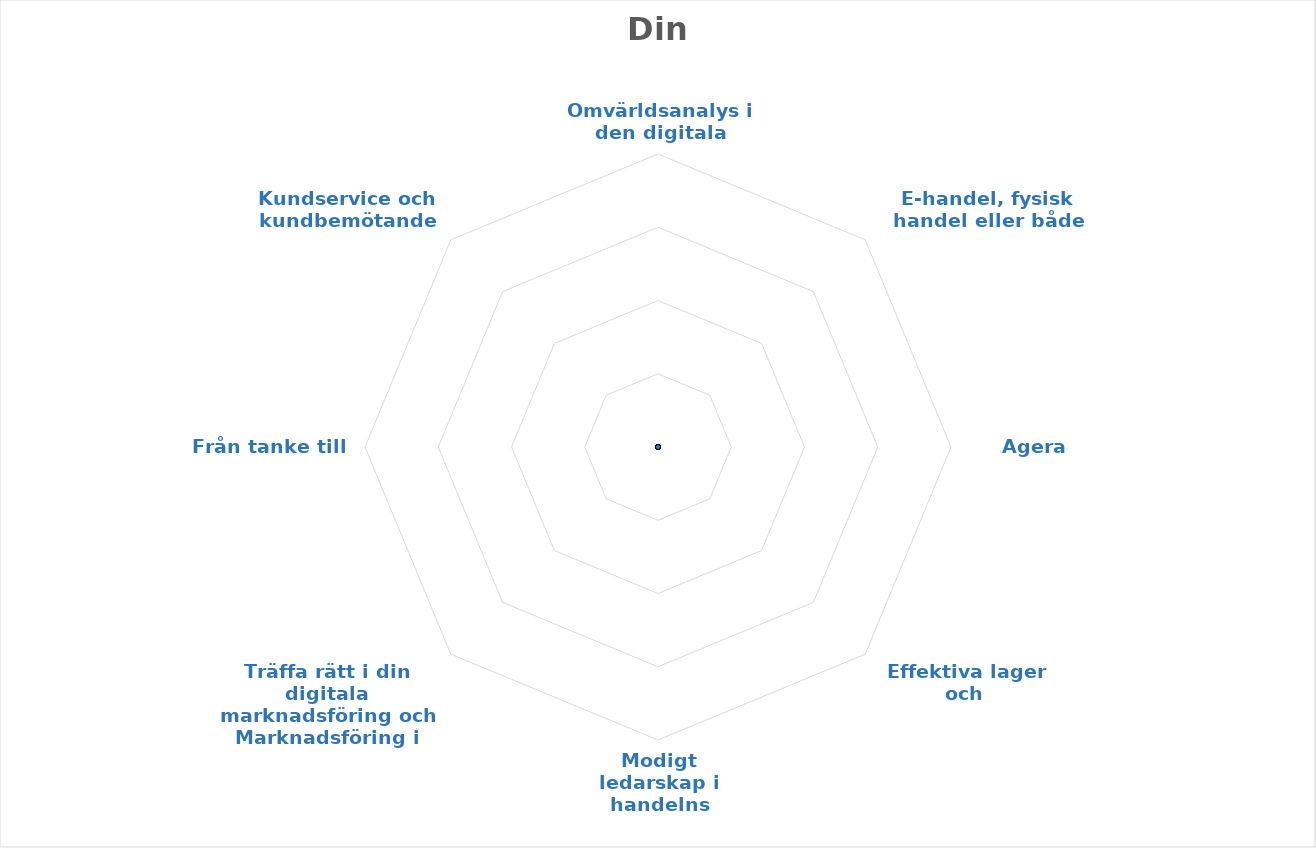
| Category | 4 |
|---|---|
| Omvärldsanalys i den digitala handeln  | 4 |
| E-handel, fysisk handel eller både och | 4 |
| Agera lönsamt | 4 |
| Effektiva lager och logistiklösningar | 4 |
| Modigt ledarskap i handelns digitala transformation | 4 |
| Träffa rätt i din digitala marknadsföring och Marknadsföring i sociala medier | 4 |
| Från tanke till köp | 4 |
| Kundservice och kundbemötande 2.0 | 4 |